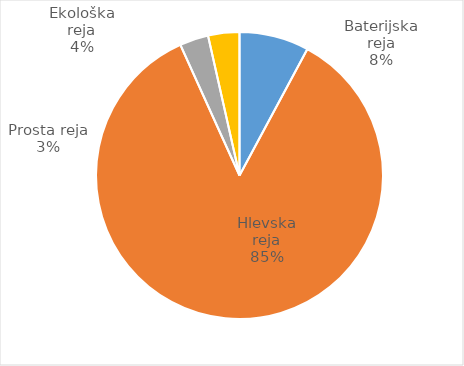
| Category | Število kosov jajc |
|---|---|
| Baterijska reja | 261729 |
| Hlevska reja | 2850713 |
| Prosta reja | 108216 |
| Ekološka reja | 117648 |